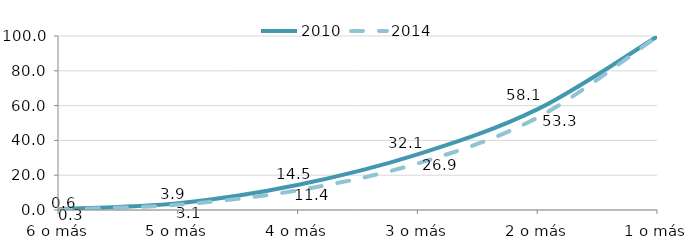
| Category | 2010 | 2014 |
|---|---|---|
| 6 o más | 0.6 | 0.3 |
| 5 o más | 3.9 | 3.1 |
| 4 o más | 14.5 | 11.4 |
| 3 o más | 32.1 | 26.9 |
| 2 o más | 58.1 | 53.3 |
| 1 o más | 100 | 100 |